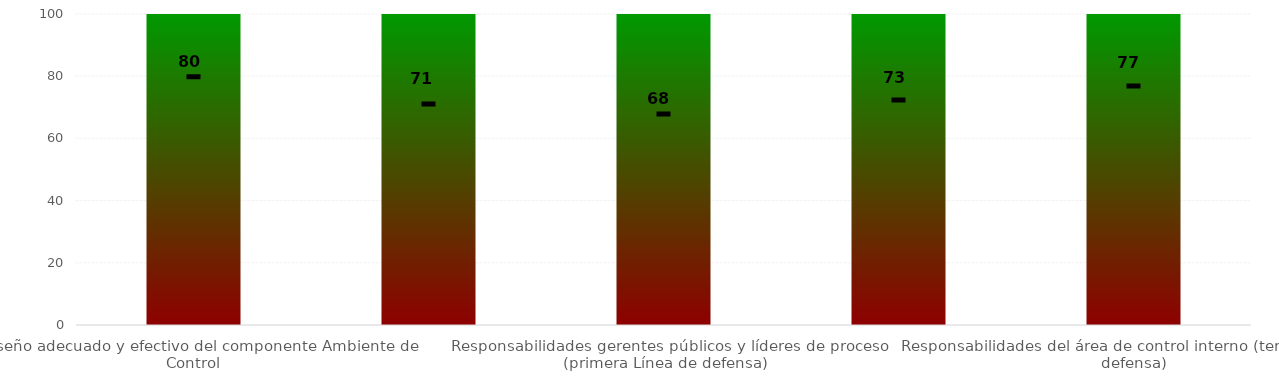
| Category | Niveles |
|---|---|
| Diseño adecuado y efectivo del componente Ambiente de Control | 100 |
| Responsabilidades de la Alta dirección y Comité Institucional de Coordinación de Control Interno (línea estratégica) | 100 |
| Responsabilidades gerentes públicos y líderes de proceso (primera Línea de defensa) | 100 |
| Responsabilidades de los servidores encargados del monitoreo y evaluación de controles y gestión del riesgo (segunda línea de defensa) | 100 |
| Responsabilidades del área de control interno (tercera línea de defensa) | 100 |